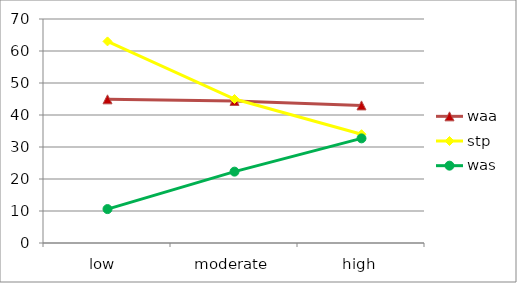
| Category | waa | stp | was |
|---|---|---|---|
| low  | 44.9 | 63 | 10.6 |
| moderate | 44.4 | 45 | 22.3 |
| high | 43 | 34 | 32.7 |